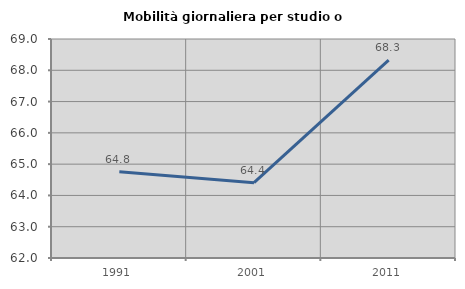
| Category | Mobilità giornaliera per studio o lavoro |
|---|---|
| 1991.0 | 64.756 |
| 2001.0 | 64.407 |
| 2011.0 | 68.324 |